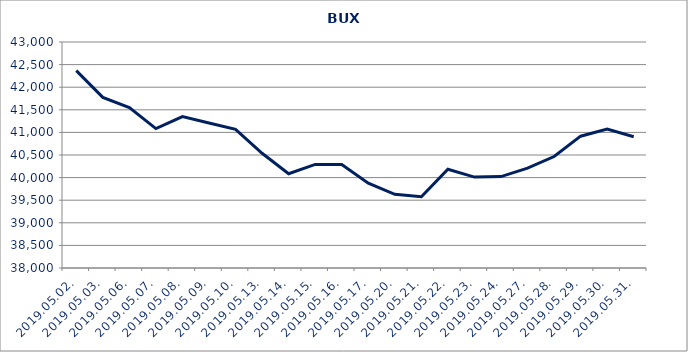
| Category | Series 0 |
|---|---|
| 2019.05.02. | 42366.822 |
| 2019.05.03. | 41775.362 |
| 2019.05.06. | 41547.348 |
| 2019.05.07. | 41084.566 |
| 2019.05.08. | 41350.332 |
| 2019.05.09. | 41207.462 |
| 2019.05.10. | 41068.206 |
| 2019.05.13. | 40537.85 |
| 2019.05.14. | 40084.639 |
| 2019.05.15. | 40291.354 |
| 2019.05.16. | 40288.281 |
| 2019.05.17. | 39877.816 |
| 2019.05.20. | 39630.707 |
| 2019.05.21. | 39575.984 |
| 2019.05.22. | 40184.851 |
| 2019.05.23. | 40010.724 |
| 2019.05.24. | 40022.617 |
| 2019.05.27. | 40207.91 |
| 2019.05.28. | 40466.853 |
| 2019.05.29. | 40916.417 |
| 2019.05.30. | 41075.874 |
| 2019.05.31. | 40904.115 |